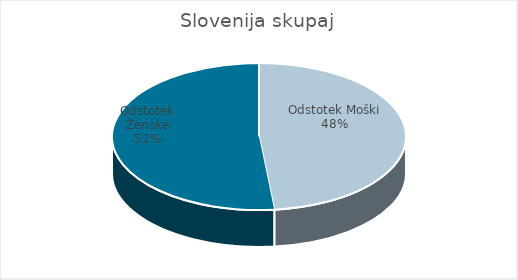
| Category | Slovenija skupaj |
|---|---|
| Odstotek Moški | 33.67 |
| Odstotek Ženske | 35.97 |